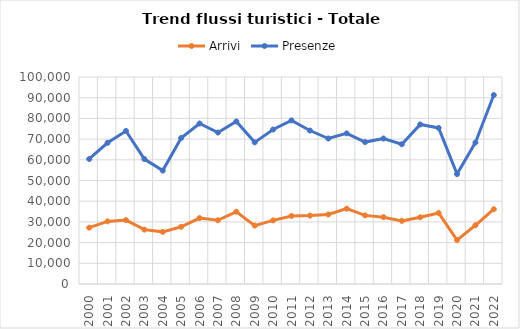
| Category | Arrivi | Presenze |
|---|---|---|
| 2000.0 | 27217 | 60389 |
| 2001.0 | 30251 | 68204 |
| 2002.0 | 30869 | 73939 |
| 2003.0 | 26272 | 60362 |
| 2004.0 | 25189 | 54789 |
| 2005.0 | 27635 | 70546 |
| 2006.0 | 31835 | 77539 |
| 2007.0 | 30767 | 73157 |
| 2008.0 | 34926 | 78523 |
| 2009.0 | 28225 | 68424 |
| 2010.0 | 30717 | 74636 |
| 2011.0 | 32871 | 79037 |
| 2012.0 | 33048 | 74142 |
| 2013.0 | 33593 | 70279 |
| 2014.0 | 36393 | 72769 |
| 2015.0 | 33150 | 68568 |
| 2016.0 | 32291 | 70281 |
| 2017.0 | 30497 | 67520 |
| 2018.0 | 32234 | 77067 |
| 2019.0 | 34309 | 75401 |
| 2020.0 | 21226 | 53093 |
| 2021.0 | 28378 | 68336 |
| 2022.0 | 36121 | 91274 |